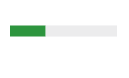
| Category | Series 0 | Series 1 |
|---|---|---|
| 0 | 0 | 0 |
| 1 | 0.333 | 0.667 |
| 2 | 0 | 0 |